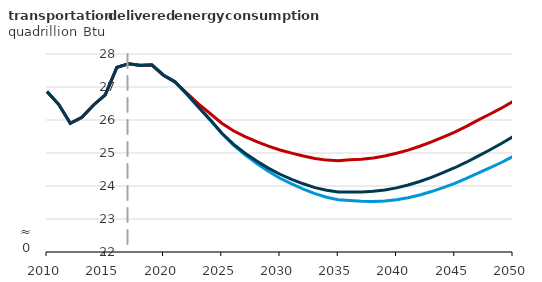
| Category | New efficiency requirements | No new efficiency requirements | Reference |
|---|---|---|---|
| 2010.0 | 26.862 | 26.862 | 26.862 |
| 2011.0 | 26.475 | 26.475 | 26.475 |
| 2012.0 | 25.901 | 25.901 | 25.901 |
| 2013.0 | 26.082 | 26.082 | 26.082 |
| 2014.0 | 26.455 | 26.455 | 26.455 |
| 2015.0 | 26.764 | 26.764 | 26.764 |
| 2016.0 | 27.594 | 27.594 | 27.599 |
| 2017.0 | 27.705 | 27.705 | 27.705 |
| 2018.0 | 27.661 | 27.662 | 27.651 |
| 2019.0 | 27.663 | 27.664 | 27.67 |
| 2020.0 | 27.35 | 27.352 | 27.365 |
| 2021.0 | 27.143 | 27.144 | 27.159 |
| 2022.0 | 26.782 | 26.816 | 26.791 |
| 2023.0 | 26.387 | 26.487 | 26.396 |
| 2024.0 | 26.002 | 26.196 | 26.012 |
| 2025.0 | 25.591 | 25.901 | 25.605 |
| 2026.0 | 25.24 | 25.674 | 25.268 |
| 2027.0 | 24.948 | 25.498 | 24.994 |
| 2028.0 | 24.682 | 25.347 | 24.757 |
| 2029.0 | 24.449 | 25.21 | 24.542 |
| 2030.0 | 24.235 | 25.091 | 24.356 |
| 2031.0 | 24.063 | 24.995 | 24.198 |
| 2032.0 | 23.903 | 24.907 | 24.067 |
| 2033.0 | 23.768 | 24.833 | 23.95 |
| 2034.0 | 23.658 | 24.784 | 23.869 |
| 2035.0 | 23.586 | 24.766 | 23.817 |
| 2036.0 | 23.559 | 24.793 | 23.82 |
| 2037.0 | 23.536 | 24.81 | 23.815 |
| 2038.0 | 23.532 | 24.851 | 23.841 |
| 2039.0 | 23.546 | 24.909 | 23.88 |
| 2040.0 | 23.583 | 24.991 | 23.943 |
| 2041.0 | 23.646 | 25.088 | 24.031 |
| 2042.0 | 23.728 | 25.205 | 24.137 |
| 2043.0 | 23.832 | 25.337 | 24.262 |
| 2044.0 | 23.951 | 25.484 | 24.405 |
| 2045.0 | 24.082 | 25.634 | 24.553 |
| 2046.0 | 24.229 | 25.807 | 24.72 |
| 2047.0 | 24.388 | 25.998 | 24.903 |
| 2048.0 | 24.546 | 26.173 | 25.091 |
| 2049.0 | 24.712 | 26.358 | 25.289 |
| 2050.0 | 24.896 | 26.566 | 25.493 |